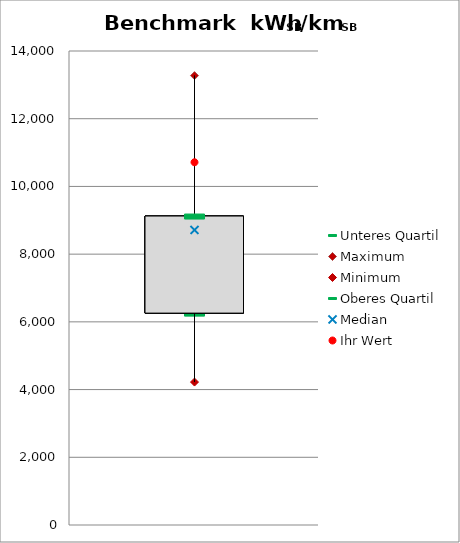
| Category | Unteres Quartil | Maximum | Minimum | Oberes Quartil |
|---|---|---|---|---|
| kWhSB/kmSB | 6258.04 | 13272.727 | 4221.833 | 9125.241 |